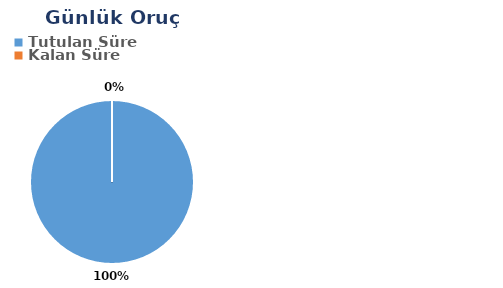
| Category | Günlük |
|---|---|
| Tutulan Süre | 0.594 |
| Kalan Süre | 0 |